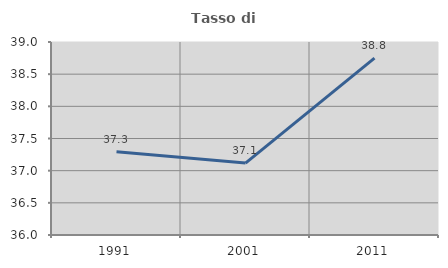
| Category | Tasso di occupazione   |
|---|---|
| 1991.0 | 37.295 |
| 2001.0 | 37.118 |
| 2011.0 | 38.75 |